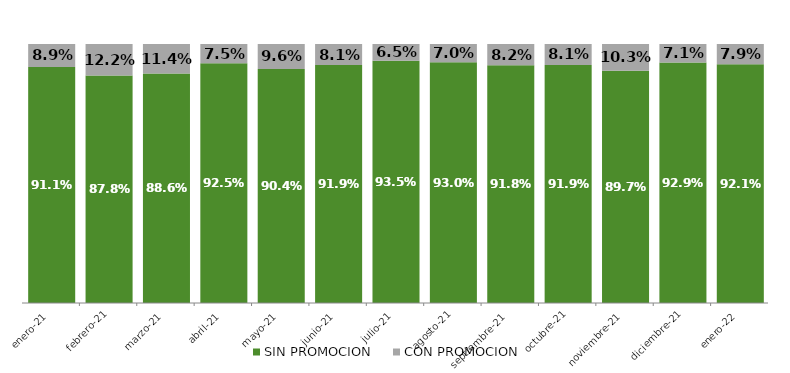
| Category | SIN PROMOCION   | CON PROMOCION   |
|---|---|---|
| 2021-01-01 | 0.911 | 0.089 |
| 2021-02-01 | 0.878 | 0.122 |
| 2021-03-01 | 0.886 | 0.114 |
| 2021-04-01 | 0.925 | 0.075 |
| 2021-05-01 | 0.904 | 0.096 |
| 2021-06-01 | 0.919 | 0.081 |
| 2021-07-01 | 0.935 | 0.065 |
| 2021-08-01 | 0.93 | 0.07 |
| 2021-09-01 | 0.918 | 0.082 |
| 2021-10-01 | 0.919 | 0.081 |
| 2021-11-01 | 0.897 | 0.103 |
| 2021-12-01 | 0.929 | 0.071 |
| 2022-01-01 | 0.921 | 0.079 |